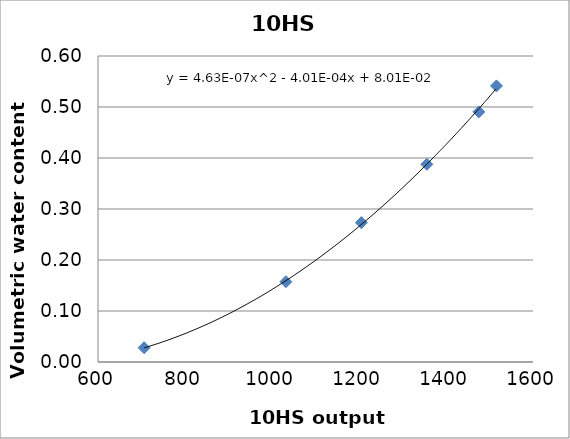
| Category | Series 0 |
|---|---|
| 706.0 | 0.028 |
| 1032.0 | 0.157 |
| 1205.5 | 0.273 |
| 1356.0 | 0.388 |
| 1475.5 | 0.49 |
| 1516.0 | 0.541 |